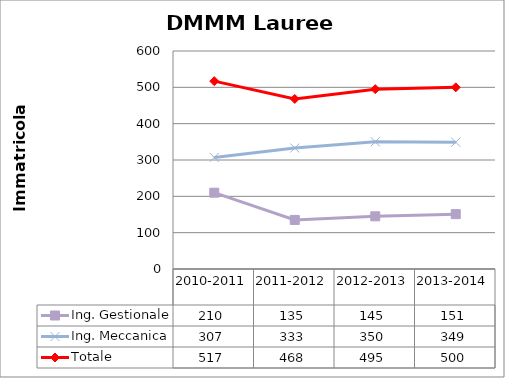
| Category | Ing. Gestionale | Ing. Meccanica | Totale |
|---|---|---|---|
| 2010-2011 | 210 | 307 | 517 |
| 2011-2012 | 135 | 333 | 468 |
| 2012-2013 | 145 | 350 | 495 |
| 2013-2014 | 151 | 349 | 500 |